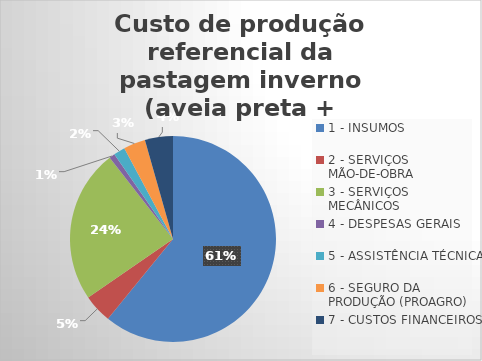
| Category | Series 0 |
|---|---|
| 1 - INSUMOS | 60.878 |
| 2 - SERVIÇOS MÃO-DE-OBRA | 4.522 |
| 3 - SERVIÇOS MECÂNICOS | 24.064 |
| 4 - DESPESAS GERAIS  | 0.895 |
| 5 - ASSISTÊNCIA TÉCNICA | 1.807 |
| 6 - SEGURO DA PRODUÇÃO (PROAGRO) | 3.437 |
| 7 - CUSTOS FINANCEIROS | 4.398 |